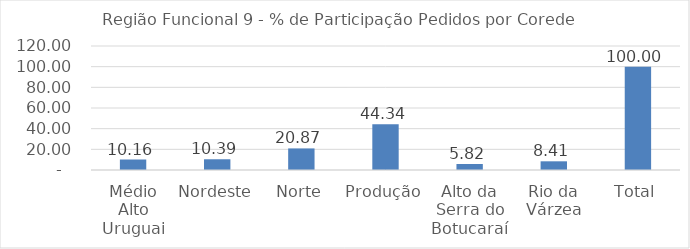
| Category | Series 0 |
|---|---|
| Médio Alto Uruguai | 10.159 |
| Nordeste | 10.391 |
| Norte | 20.872 |
| Produção | 44.342 |
| Alto da Serra do Botucaraí | 5.825 |
| Rio da Várzea | 8.411 |
| Total | 100 |